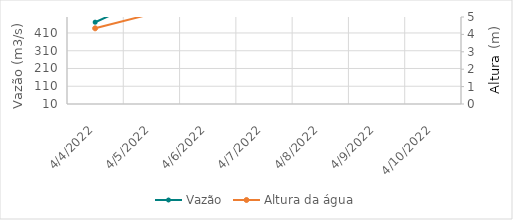
| Category | Vazão |
|---|---|
| 2/23/22 | 322.81 |
| 2/22/22 | 341.9 |
| 2/21/22 | 388.85 |
| 2/20/22 | 427.81 |
| 2/19/22 | 415.12 |
| 2/18/22 | 354.31 |
| 2/17/22 | 371.69 |